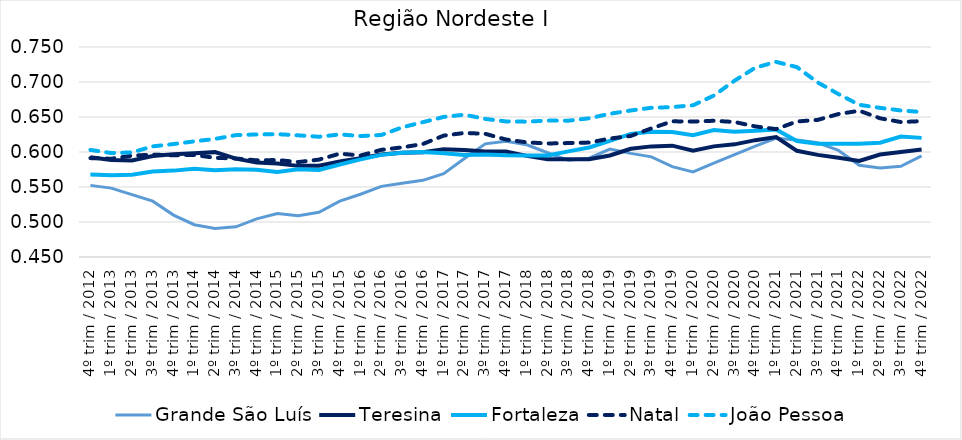
| Category | Grande São Luís | Teresina | Fortaleza | Natal | João Pessoa |
|---|---|---|---|---|---|
| 4º trim / 2012 | 0.552 | 0.592 | 0.568 | 0.591 | 0.603 |
| 1º trim / 2013 | 0.548 | 0.588 | 0.567 | 0.59 | 0.598 |
| 2º trim / 2013 | 0.539 | 0.588 | 0.567 | 0.595 | 0.599 |
| 3º trim / 2013 | 0.53 | 0.594 | 0.572 | 0.596 | 0.608 |
| 4º trim / 2013 | 0.51 | 0.597 | 0.573 | 0.595 | 0.611 |
| 1º trim / 2014 | 0.496 | 0.598 | 0.576 | 0.596 | 0.615 |
| 2º trim / 2014 | 0.491 | 0.6 | 0.574 | 0.592 | 0.619 |
| 3º trim / 2014 | 0.493 | 0.591 | 0.575 | 0.591 | 0.624 |
| 4º trim / 2014 | 0.505 | 0.585 | 0.575 | 0.588 | 0.625 |
| 1º trim / 2015 | 0.512 | 0.584 | 0.571 | 0.589 | 0.625 |
| 2º trim / 2015 | 0.509 | 0.58 | 0.575 | 0.586 | 0.624 |
| 3º trim / 2015 | 0.514 | 0.581 | 0.574 | 0.589 | 0.622 |
| 4º trim / 2015 | 0.53 | 0.586 | 0.582 | 0.598 | 0.625 |
| 1º trim / 2016 | 0.54 | 0.591 | 0.589 | 0.595 | 0.623 |
| 2º trim / 2016 | 0.551 | 0.596 | 0.596 | 0.603 | 0.624 |
| 3º trim / 2016 | 0.555 | 0.599 | 0.599 | 0.607 | 0.635 |
| 4º trim / 2016 | 0.56 | 0.6 | 0.6 | 0.611 | 0.643 |
| 1º trim / 2017 | 0.569 | 0.604 | 0.598 | 0.623 | 0.65 |
| 2º trim / 2017 | 0.591 | 0.603 | 0.596 | 0.627 | 0.653 |
| 3º trim / 2017 | 0.612 | 0.601 | 0.596 | 0.626 | 0.647 |
| 4º trim / 2017 | 0.615 | 0.601 | 0.595 | 0.618 | 0.644 |
| 1º trim / 2018 | 0.61 | 0.594 | 0.595 | 0.614 | 0.643 |
| 2º trim / 2018 | 0.599 | 0.59 | 0.595 | 0.612 | 0.645 |
| 3º trim / 2018 | 0.588 | 0.59 | 0.601 | 0.613 | 0.645 |
| 4º trim / 2018 | 0.591 | 0.59 | 0.606 | 0.613 | 0.648 |
| 1º trim / 2019 | 0.604 | 0.595 | 0.616 | 0.619 | 0.655 |
| 2º trim / 2019 | 0.598 | 0.605 | 0.626 | 0.623 | 0.659 |
| 3º trim / 2019 | 0.593 | 0.608 | 0.629 | 0.634 | 0.663 |
| 4º trim / 2019 | 0.579 | 0.609 | 0.629 | 0.644 | 0.664 |
| 1º trim / 2020 | 0.572 | 0.602 | 0.624 | 0.644 | 0.667 |
| 2º trim / 2020 | 0.584 | 0.608 | 0.632 | 0.645 | 0.681 |
| 3º trim / 2020 | 0.596 | 0.611 | 0.629 | 0.643 | 0.702 |
| 4º trim / 2020 | 0.608 | 0.617 | 0.63 | 0.637 | 0.721 |
| 1º trim / 2021 | 0.62 | 0.621 | 0.632 | 0.633 | 0.729 |
| 2º trim / 2021 | 0.617 | 0.602 | 0.616 | 0.644 | 0.721 |
| 3º trim / 2021 | 0.613 | 0.596 | 0.612 | 0.646 | 0.699 |
| 4º trim / 2021 | 0.602 | 0.592 | 0.612 | 0.654 | 0.683 |
| 1º trim / 2022 | 0.581 | 0.587 | 0.612 | 0.659 | 0.667 |
| 2º trim / 2022 | 0.577 | 0.596 | 0.613 | 0.648 | 0.663 |
| 3º trim / 2022 | 0.579 | 0.6 | 0.622 | 0.643 | 0.659 |
| 4º trim / 2022 | 0.594 | 0.604 | 0.62 | 0.644 | 0.657 |